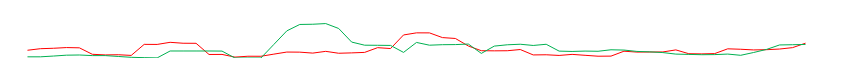
| Category | Series 0 | Series 1 |
|---|---|---|
| 2018-03-08 15:30:00 | 463 | 424 |
| 2018-03-08 15:14:59 | 324 | 415 |
| 2018-03-08 15:14:58 | 280 | 408 |
| 2018-03-08 15:14:57 | 260 | 269 |
| 2018-03-08 15:14:56 | 252 | 172 |
| 2018-03-08 15:14:55 | 273 | 84 |
| 2018-03-08 15:14:54 | 287 | 123 |
| 2018-03-08 15:14:53 | 138 | 106 |
| 2018-03-08 15:14:52 | 128 | 103 |
| 2018-03-08 15:14:51 | 134 | 112 |
| 2018-03-08 15:14:50 | 253 | 122 |
| 2018-03-08 15:14:49 | 189 | 169 |
| 2018-03-08 15:14:48 | 187 | 192 |
| 2018-03-08 15:14:47 | 185 | 206 |
| 2018-03-08 15:14:46 | 212 | 248 |
| 2018-03-08 15:14:45 | 59 | 257 |
| 2018-03-08 15:14:44 | 56 | 210 |
| 2018-03-08 15:14:43 | 84 | 216 |
| 2018-03-08 15:14:42 | 113 | 205 |
| 2018-03-08 15:14:41 | 80 | 215 |
| 2018-03-08 15:14:40 | 101 | 429 |
| 2018-03-08 15:14:39 | 96 | 392 |
| 2018-03-08 15:14:38 | 265 | 430 |
| 2018-03-08 15:14:37 | 227 | 413 |
| 2018-03-08 15:14:36 | 224 | 372 |
| 2018-03-08 15:14:35 | 228 | 144 |
| 2018-03-08 15:14:34 | 375 | 436 |
| 2018-03-08 15:14:33 | 610 | 419 |
| 2018-03-08 15:14:32 | 638 | 416 |
| 2018-03-08 15:14:31 | 785 | 400 |
| 2018-03-08 15:14:30 | 786 | 486 |
| 2018-03-08 15:14:29 | 720 | 175 |
| 2018-03-08 15:14:28 | 295 | 393 |
| 2018-03-08 15:14:27 | 323 | 397 |
| 2018-03-08 15:14:26 | 175 | 400 |
| 2018-03-08 15:14:25 | 160 | 498 |
| 2018-03-08 15:14:24 | 148 | 922 |
| 2018-03-08 15:14:23 | 208 | 1076 |
| 2018-03-08 15:14:22 | 153 | 1055 |
| 2018-03-08 15:14:21 | 183 | 1048 |
| 2018-03-08 15:14:20 | 186 | 848 |
| 2018-03-08 15:14:19 | 121 | 424 |
| 2018-03-08 15:14:18 | 54 | 0 |
| 2018-03-08 15:14:17 | 55 | 0 |
| 2018-03-08 15:14:16 | 28 | 0 |
| 2018-03-08 15:14:15 | 112 | 216 |
| 2018-03-08 15:14:14 | 110 | 219 |
| 2018-03-08 15:14:13 | 459 | 219 |
| 2018-03-08 15:14:12 | 461 | 219 |
| 2018-03-08 15:14:11 | 490 | 219 |
| 2018-03-08 15:14:10 | 424 | 3 |
| 2018-03-08 15:14:09 | 426 | 11 |
| 2018-03-08 15:14:08 | 81 | 21 |
| 2018-03-08 15:14:07 | 102 | 48 |
| 2018-03-08 15:14:06 | 96 | 75 |
| 2018-03-08 15:14:05 | 116 | 75 |
| 2018-03-08 15:14:04 | 318 | 94 |
| 2018-03-08 15:14:03 | 326 | 88 |
| 2018-03-08 15:14:02 | 304 | 61 |
| 2018-03-08 15:14:01 | 291 | 37 |
| 2018-03-08 15:14:00 | 242 | 37 |